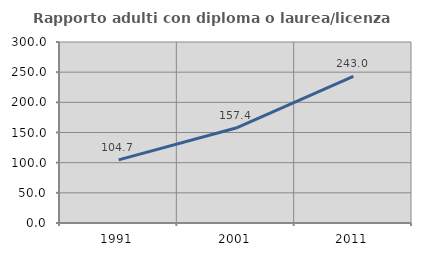
| Category | Rapporto adulti con diploma o laurea/licenza media  |
|---|---|
| 1991.0 | 104.705 |
| 2001.0 | 157.378 |
| 2011.0 | 243.044 |